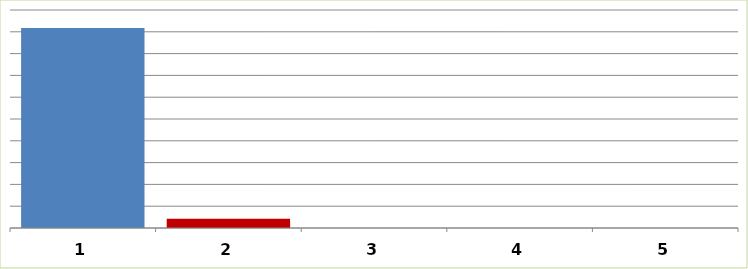
| Category | Series 0 |
|---|---|
| 0 | 917999.7 |
| 1 | 42000 |
| 2 | 0 |
| 3 | 0 |
| 4 | 0 |